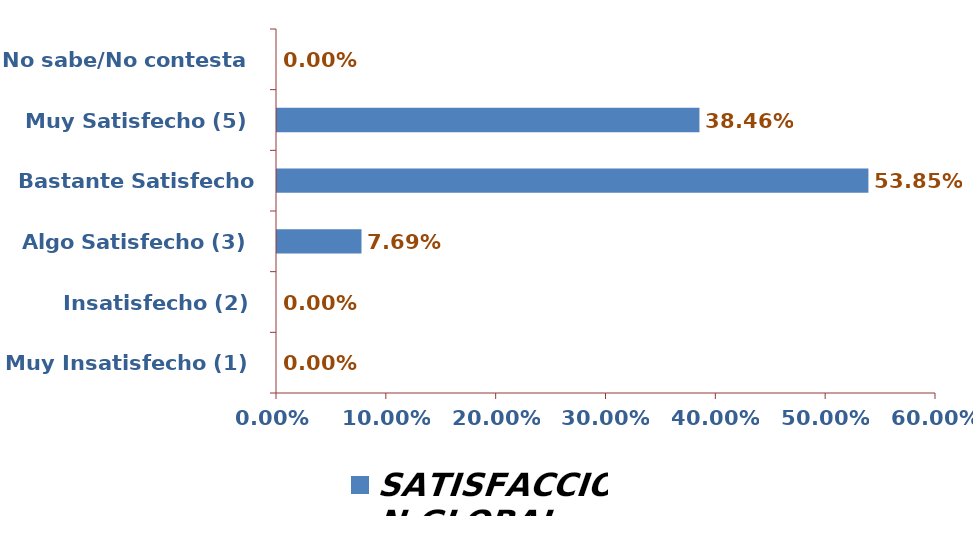
| Category | SATISFACCIÓN GLOBAL |
|---|---|
| Muy Insatisfecho (1) | 0 |
| Insatisfecho (2) | 0 |
| Algo Satisfecho (3) | 0.077 |
| Bastante Satisfecho (4) | 0.538 |
| Muy Satisfecho (5) | 0.385 |
| No sabe/No contesta | 0 |